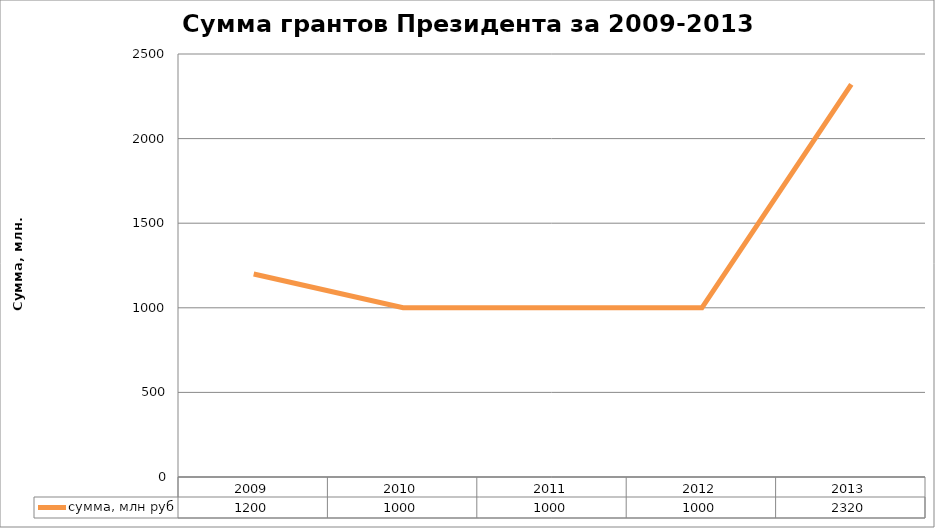
| Category | сумма, млн руб |
|---|---|
| 2009.0 | 1200 |
| 2010.0 | 1000 |
| 2011.0 | 1000 |
| 2012.0 | 1000 |
| 2013.0 | 2320 |